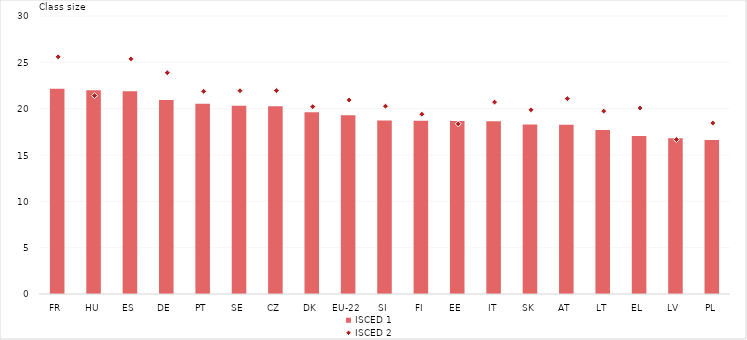
| Category | ISCED 1 |
|---|---|
| FR | 22.142 |
| HU | 22 |
| ES | 21.867 |
| DE | 20.937 |
| PT | 20.525 |
| SE | 20.303 |
| CZ | 20.27 |
| DK | 19.621 |
| EU-22 | 19.284 |
| SI | 18.724 |
| FI | 18.693 |
| EE | 18.672 |
| IT | 18.655 |
| SK | 18.296 |
| AT | 18.255 |
| LT | 17.698 |
| EL | 17.047 |
| LV | 16.795 |
| PL | 16.607 |